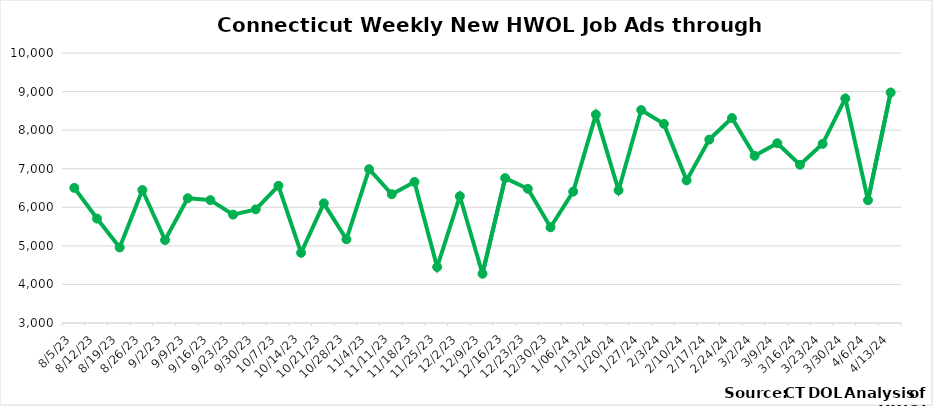
| Category | Connecticut |
|---|---|
| 8/5/23 | 6503 |
| 8/12/23 | 5708 |
| 8/19/23 | 4958 |
| 8/26/23 | 6447 |
| 9/2/23 | 5149 |
| 9/9/23 | 6235 |
| 9/16/23 | 6186 |
| 9/23/23 | 5810 |
| 9/30/23 | 5946 |
| 10/7/23 | 6558 |
| 10/14/23 | 4820 |
| 10/21/23 | 6103 |
| 10/28/23 | 5171 |
| 11/4/23 | 6987 |
| 11/11/23 | 6338 |
| 11/18/23 | 6658 |
| 11/25/23 | 4451 |
| 12/2/23 | 6286 |
| 12/9/23 | 4276 |
| 12/16/23 | 6757 |
|  12/23/23 | 6479 |
|  12/30/23 | 5482 |
|  1/06/24 | 6407 |
|  1/13/24 | 8403 |
|  1/20/24 | 6441 |
|  1/27/24 | 8521 |
|  2/3/24 | 8162 |
|  2/10/24 | 6698 |
|  2/17/24 | 7755 |
|  2/24/24 | 8314 |
|  3/2/24 | 7334 |
|  3/9/24 | 7661 |
|  3/16/24 | 7102 |
|  3/23/24 | 7645 |
|  3/30/24 | 8822 |
|  4/6/24 | 6183 |
|  4/13/24 | 8976 |